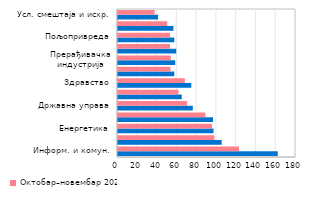
| Category | Октобар–новембар 2021. | Октобар–новембар 2020. |
|---|---|---|
| Информ. и комун. | 161.518 | 122.317 |
| Финансијски сектор | 104.835 | 97.474 |
| Енергетика | 96.624 | 95.064 |
| Рударство | 96.092 | 88.378 |
| Државна управа | 75.64 | 69.878 |
| Образовање | 64.439 | 61.182 |
| Здравство | 74.124 | 67.55 |
| Саобраћај и складиштење | 56.892 | 53.107 |
| Прерађивачка индустрија | 57.842 | 53.398 |
| Грађевинарство | 58.879 | 52.608 |
| Пољопривреда | 56.95 | 52.672 |
| Трговина | 56.022 | 49.825 |
| Усл. смештаја и исхр. | 40.519 | 37.054 |